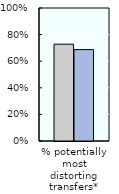
| Category | 2000-02 | 2018-20 |
|---|---|---|
| % potentially most distorting transfers* | 0.728 | 0.687 |